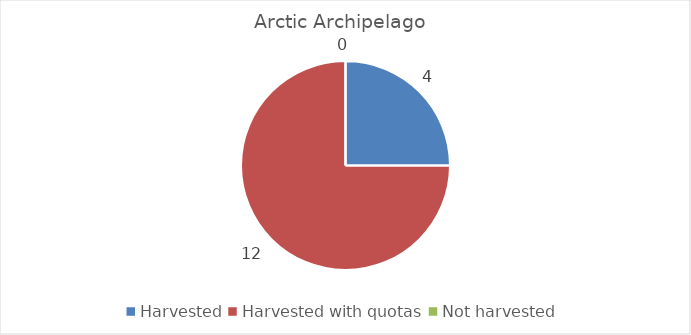
| Category | Arctic Archipelago |
|---|---|
| Harvested | 4 |
| Harvested with quotas | 12 |
| Not harvested | 0 |